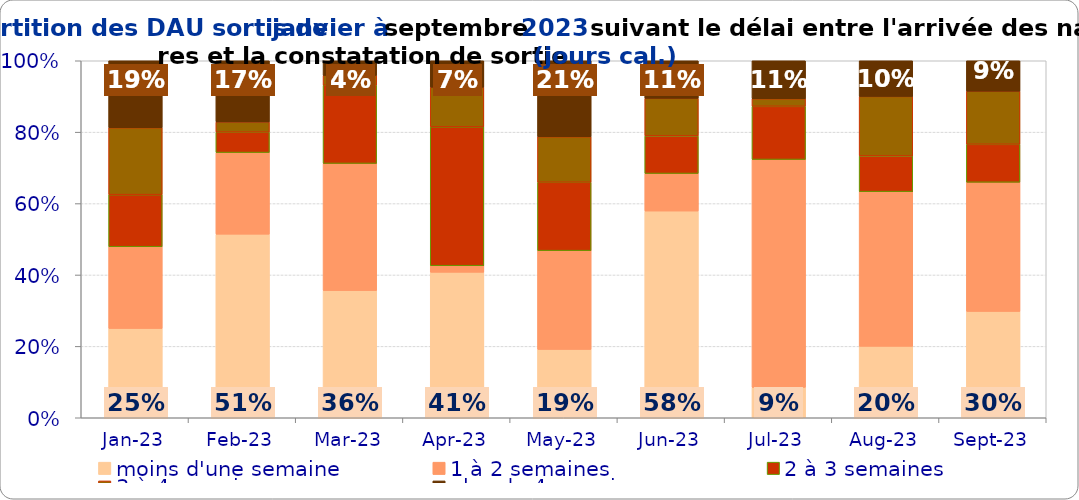
| Category | moins d'une semaine | 1 à 2 semaines | 2 à 3 semaines | 3 à 4 semaines | plus de 4 semaines |
|---|---|---|---|---|---|
| 2023-01-01 | 0.25 | 0.229 | 0.146 | 0.188 | 0.188 |
| 2023-02-01 | 0.514 | 0.229 | 0.057 | 0.029 | 0.171 |
| 2023-03-01 | 0.356 | 0.356 | 0.219 | 0.027 | 0.041 |
| 2023-04-01 | 0.407 | 0.019 | 0.389 | 0.111 | 0.074 |
| 2023-05-01 | 0.191 | 0.277 | 0.191 | 0.128 | 0.213 |
| 2023-06-01 | 0.579 | 0.105 | 0.105 | 0.105 | 0.105 |
| 2023-07-01 | 0.085 | 0.638 | 0.149 | 0.021 | 0.106 |
| 2023-08-01 | 0.2 | 0.433 | 0.1 | 0.167 | 0.1 |
| 2023-09-01 | 0.298 | 0.362 | 0.106 | 0.149 | 0.085 |